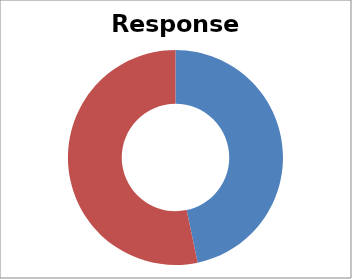
| Category | Total |
|---|---|
| Sum of Overall Response | 46.693 |
| Sum of Non-resp | 53.307 |